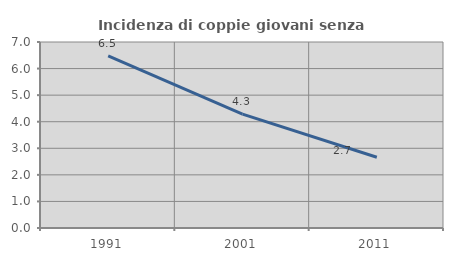
| Category | Incidenza di coppie giovani senza figli |
|---|---|
| 1991.0 | 6.48 |
| 2001.0 | 4.286 |
| 2011.0 | 2.665 |